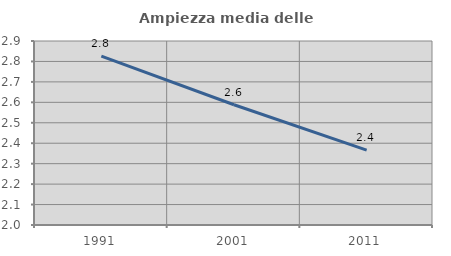
| Category | Ampiezza media delle famiglie |
|---|---|
| 1991.0 | 2.826 |
| 2001.0 | 2.588 |
| 2011.0 | 2.367 |